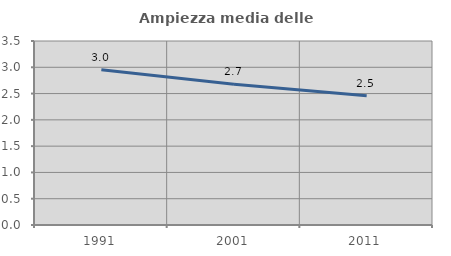
| Category | Ampiezza media delle famiglie |
|---|---|
| 1991.0 | 2.955 |
| 2001.0 | 2.677 |
| 2011.0 | 2.461 |